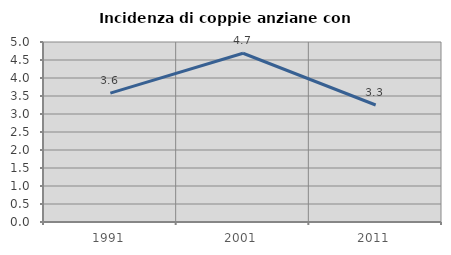
| Category | Incidenza di coppie anziane con figli |
|---|---|
| 1991.0 | 3.579 |
| 2001.0 | 4.688 |
| 2011.0 | 3.25 |